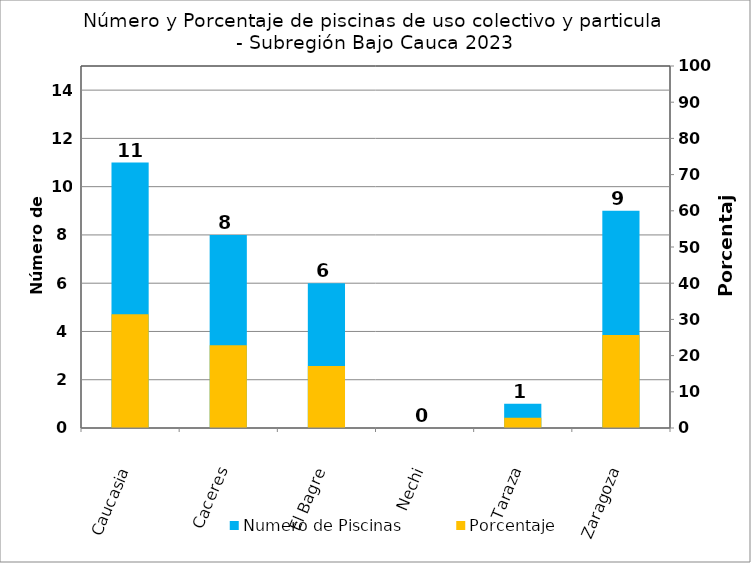
| Category | Numero de Piscinas |
|---|---|
| Caucasia | 11 |
| Caceres | 8 |
| El Bagre | 6 |
| Nechi | 0 |
| Taraza | 1 |
| Zaragoza | 9 |